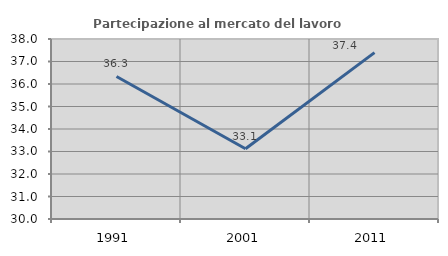
| Category | Partecipazione al mercato del lavoro  femminile |
|---|---|
| 1991.0 | 36.336 |
| 2001.0 | 33.121 |
| 2011.0 | 37.394 |